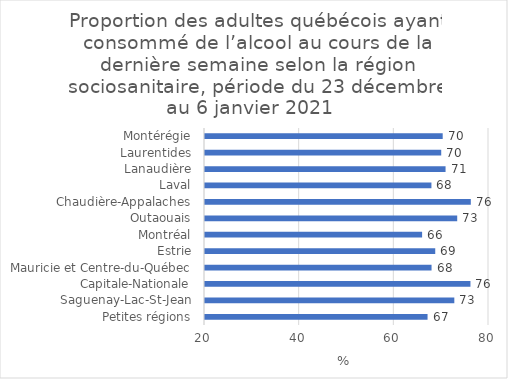
| Category | Series 0 |
|---|---|
| Petites régions | 67.018 |
| Saguenay-Lac-St-Jean | 72.674 |
| Capitale-Nationale | 76.081 |
| Mauricie et Centre-du-Québec | 67.863 |
| Estrie | 68.643 |
| Montréal | 65.868 |
| Outaouais | 73.284 |
| Chaudière-Appalaches | 76.159 |
| Laval | 67.838 |
| Lanaudière | 70.822 |
| Laurentides | 69.907 |
| Montérégie | 70.22 |